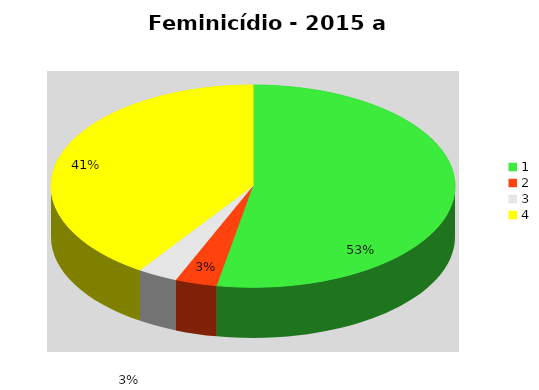
| Category | Series 0 |
|---|---|
| 0 | 1420 |
| 1 | 90 |
| 2 | 86 |
| 3 | 1090 |